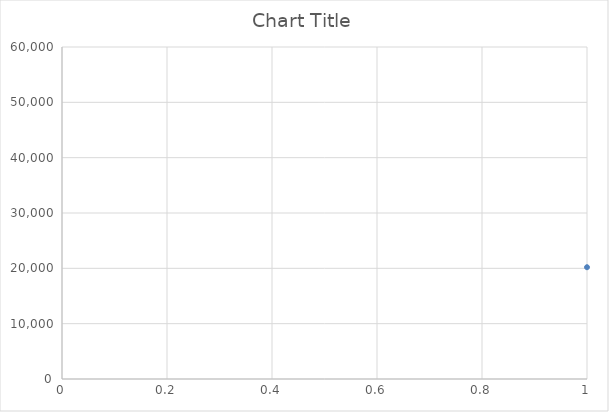
| Category | Series 0 |
|---|---|
| 0 | 20200 |
| 1 | 32600 |
| 2 | 33800 |
| 3 | 31000 |
| 4 | 32000 |
| 5 | 31800 |
| 6 | 30800 |
| 7 | 31200 |
| 8 | 30400 |
| 9 | 42500 |
| 10 | 43000 |
| 11 | 20000 |
| 12 | 32200 |
| 13 | 31600 |
| 14 | 32600 |
| 15 | 32000 |
| 16 | 32000 |
| 17 | 31800 |
| 18 | 31800 |
| 19 | 31200 |
| 20 | 41000 |
| 21 | 41500 |
| 22 | 9800 |
| 23 | 13000 |
| 24 | 19000 |
| 25 | 18000 |
| 26 | 24000 |
| 27 | 12200 |
| 28 | 9000 |
| 29 | 25000 |
| 30 | 9800 |
| 31 | 12000 |
| 32 | 18000 |
| 33 | 9800 |
| 34 | 23800 |
| 35 | 24000 |
| 36 | 35738 |
| 37 | 35404 |
| 38 | 46500 |
| 39 | 33400 |
| 40 | 45500 |
| 41 | 55500 |
| 42 | 23600 |
| 43 | 33400 |
| 44 | 35738 |
| 45 | 24000 |
| 46 | 35404 |
| 47 | 23800 |
| 48 | 46500 |
| 49 | 33400 |
| 50 | 55500 |
| 51 | 55500 |
| 52 | 23600 |
| 53 | 45500 |
| 54 | 45500 |
| 55 | 23600 |
| 56 | 33400 |
| 57 | 33400 |
| 58 | 23000 |
| 59 | 28000 |
| 60 | 23000 |
| 61 | 48000 |
| 62 | 48000 |
| 63 | 19000 |
| 64 | 24000 |
| 65 | 19000 |
| 66 | 36000 |
| 67 | 18000 |
| 68 | 18000 |
| 69 | 36000 |
| 70 | 18000 |
| 71 | 10900 |
| 72 | 11800 |
| 73 | 28000 |
| 74 | 24000 |
| 75 | 9000 |
| 76 | 13000 |
| 77 | 19000 |
| 78 | 18000 |
| 79 | 10900 |
| 80 | 11800 |
| 81 | 13500 |
| 82 | 16200 |
| 83 | 10000 |
| 84 | 21600 |
| 85 | 18000 |
| 86 | 18940 |
| 87 | 16000 |
| 88 | 25400 |
| 89 | 18900 |
| 90 | 12000 |
| 91 | 21600 |
| 92 | 18056 |
| 93 | 18000 |
| 94 | 10089 |
| 95 | 13679 |
| 96 | 12000 |
| 97 | 14400 |
| 98 | 24000 |
| 99 | 18295 |
| 100 | 10942 |
| 101 | 24000 |
| 102 | 8806.37 |
| 103 | 13000 |
| 104 | 11000 |
| 105 | 23250 |
| 106 | 24000 |
| 107 | 10800 |
| 108 | 13300 |
| 109 | 27000 |
| 110 | 13600 |
| 111 | 21850 |
| 112 | 21850 |
| 113 | 22600 |
| 114 | 22000 |
| 115 | 25000 |
| 116 | 36400 |
| 117 | 21600 |
| 118 | 21600 |
| 119 | 18000 |
| 120 | 18000 |
| 121 | 16000 |
| 122 | 16000 |
| 123 | 16000 |
| 124 | 16000 |
| 125 | 12000 |
| 126 | 16000 |
| 127 | 12000 |
| 128 | 12000 |
| 129 | 12000 |
| 130 | 12000 |
| 131 | 18000 |
| 132 | 18000 |
| 133 | 18000 |
| 134 | 18000 |
| 135 | 16000 |
| 136 | 16000 |
| 137 | 16000 |
| 138 | 12000 |
| 139 | 12000 |
| 140 | 16000 |
| 141 | 12000 |
| 142 | 12000 |
| 143 | 42000 |
| 144 | 54000 |
| 145 | 12000 |
| 146 | 12000 |
| 147 | 24000 |
| 148 | 9800 |
| 149 | 18000 |
| 150 | 25000 |
| 151 | 10000 |
| 152 | 10000 |
| 153 | 12000 |
| 154 | 12000 |
| 155 | 12000 |
| 156 | 12000 |
| 157 | 12000 |
| 158 | 25000 |
| 159 | 25000 |
| 160 | 48000 |
| 161 | 19000 |
| 162 | 28000 |
| 163 | 18000 |
| 164 | 18000 |
| 165 | 18000 |
| 166 | 18000 |
| 167 | 28000 |
| 168 | 10900 |
| 169 | 10000 |
| 170 | 10000 |
| 171 | 12000 |
| 172 | 12000 |
| 173 | 24400 |
| 174 | 24400 |
| 175 | 18000 |
| 176 | 36000 |
| 177 | 10000 |
| 178 | 24400 |
| 179 | 9800 |
| 180 | 9800 |
| 181 | 24000 |
| 182 | 24000 |
| 183 | 12000 |
| 184 | 12000 |
| 185 | 10900 |
| 186 | 11000 |
| 187 | 10900 |
| 188 | 24000 |
| 189 | 25000 |
| 190 | 25000 |
| 191 | 24000 |
| 192 | 11800 |
| 193 | 11800 |
| 194 | 12000 |
| 195 | 9000 |
| 196 | 13000 |
| 197 | 19000 |
| 198 | 18000 |
| 199 | 9000 |
| 200 | 12200 |
| 201 | 24000 |
| 202 | 18000 |
| 203 | 24000 |
| 204 | 12200 |
| 205 | 9000 |
| 206 | 9000 |
| 207 | 12600 |
| 208 | 27700 |
| 209 | 20400 |
| 210 | 16000 |
| 211 | 22000 |
| 212 | 10000 |
| 213 | 16500 |
| 214 | 12000 |
| 215 | 9000 |
| 216 | 13000 |
| 217 | 19000 |
| 218 | 9000 |
| 219 | 13000 |
| 220 | 19000 |
| 221 | 9000 |
| 222 | 13000 |
| 223 | 19000 |
| 224 | 9000 |
| 225 | 13000 |
| 226 | 19000 |
| 227 | 9000 |
| 228 | 13000 |
| 229 | 19000 |
| 230 | 9000 |
| 231 | 13000 |
| 232 | 19000 |
| 233 | 9000 |
| 234 | 13000 |
| 235 | 19000 |
| 236 | 12000 |
| 237 | 12000 |
| 238 | 12000 |
| 239 | 24000 |
| 240 | 24000 |
| 241 | 28000 |
| 242 | 10900 |
| 243 | 10900 |
| 244 | 36000 |
| 245 | 13600 |
| 246 | 27000 |
| 247 | 22000 |
| 248 | 32000 |
| 249 | 36000 |
| 250 | 54000 |
| 251 | 20000 |
| 252 | 23250 |
| 253 | 27600 |
| 254 | 24000 |
| 255 | 10800 |
| 256 | 10800 |
| 257 | 13300 |
| 258 | 13300 |
| 259 | 27000 |
| 260 | 11000 |
| 261 | 12000 |
| 262 | 22000 |
| 263 | 18000 |
| 264 | 38000 |
| 265 | 25000 |
| 266 | 25000 |
| 267 | 10900 |
| 268 | 21600 |
| 269 | 13600 |
| 270 | 45000 |
| 271 | 28600 |
| 272 | 28600 |
| 273 | 48000 |
| 274 | 20300 |
| 275 | 45000 |
| 276 | 21000 |
| 277 | 13600 |
| 278 | 18000 |
| 279 | 18000 |
| 280 | 20300 |
| 281 | 13000 |
| 282 | 13600 |
| 283 | 8700 |
| 284 | 10900 |
| 285 | 11000 |
| 286 | 10900 |
| 287 | 8700 |
| 288 | 22400 |
| 289 | 34400 |
| 290 | 22400 |
| 291 | 34400 |
| 292 | 21600 |
| 293 | 9000 |
| 294 | 11500 |
| 295 | 26000 |
| 296 | 12000 |
| 297 | 13800 |
| 298 | 18000 |
| 299 | 13600 |
| 300 | 10900 |
| 301 | 28600 |
| 302 | 25000 |
| 303 | 22000 |
| 304 | 12000 |
| 305 | 32000 |
| 306 | 12000 |
| 307 | 11000 |
| 308 | 14000 |
| 309 | 32000 |
| 310 | 12000 |
| 311 | 27000 |
| 312 | 13600 |
| 313 | 12600 |
| 314 | 10800 |
| 315 | 18000 |
| 316 | 20200 |
| 317 | 20200 |
| 318 | 32600 |
| 319 | 33800 |
| 320 | 31000 |
| 321 | 32000 |
| 322 | 31800 |
| 323 | 30800 |
| 324 | 31200 |
| 325 | 30400 |
| 326 | 42500 |
| 327 | 43000 |
| 328 | 20000 |
| 329 | 32200 |
| 330 | 31600 |
| 331 | 32600 |
| 332 | 32000 |
| 333 | 32000 |
| 334 | 31800 |
| 335 | 31800 |
| 336 | 31200 |
| 337 | 41000 |
| 338 | 41500 |
| 339 | 9800 |
| 340 | 13000 |
| 341 | 19000 |
| 342 | 18000 |
| 343 | 24000 |
| 344 | 12200 |
| 345 | 9000 |